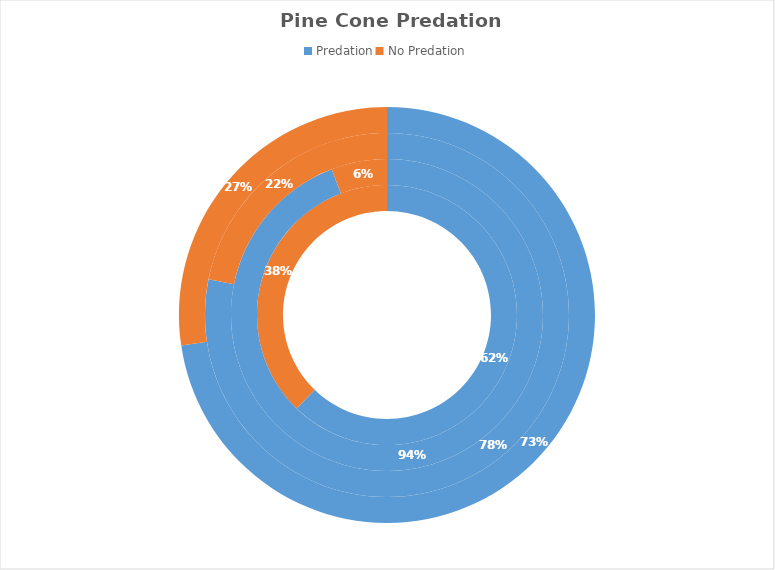
| Category | Transect part A (Ascending North-facing slope) | Transect part B (Ridgeline) | Transect part C (Descending North-facing slope) | Total |
|---|---|---|---|---|
| Predation | 145 | 49 | 186 | 380 |
| No Predation | 88 | 3 | 52 | 143 |